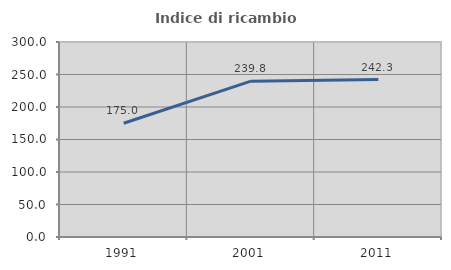
| Category | Indice di ricambio occupazionale  |
|---|---|
| 1991.0 | 175 |
| 2001.0 | 239.773 |
| 2011.0 | 242.308 |